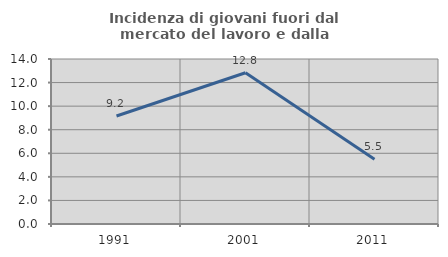
| Category | Incidenza di giovani fuori dal mercato del lavoro e dalla formazione  |
|---|---|
| 1991.0 | 9.16 |
| 2001.0 | 12.834 |
| 2011.0 | 5.488 |